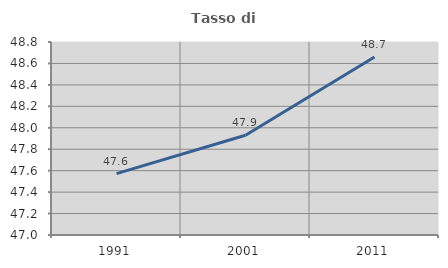
| Category | Tasso di occupazione   |
|---|---|
| 1991.0 | 47.573 |
| 2001.0 | 47.93 |
| 2011.0 | 48.66 |